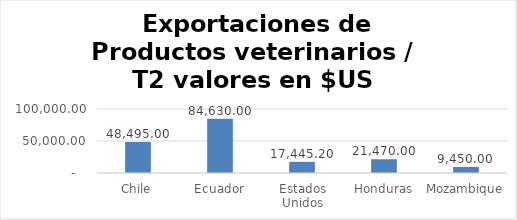
| Category | Valor US  |
|---|---|
| Chile | 48495 |
| Ecuador | 84630 |
| Estados Unidos | 17445.199 |
| Honduras | 21470 |
| Mozambique | 9450 |